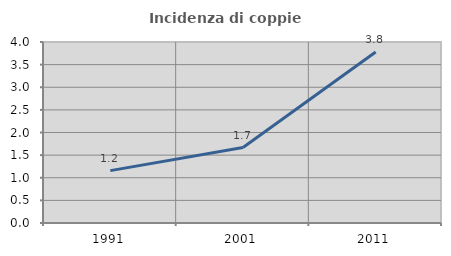
| Category | Incidenza di coppie miste |
|---|---|
| 1991.0 | 1.157 |
| 2001.0 | 1.667 |
| 2011.0 | 3.778 |